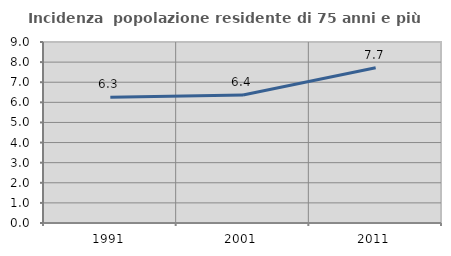
| Category | Incidenza  popolazione residente di 75 anni e più |
|---|---|
| 1991.0 | 6.253 |
| 2001.0 | 6.362 |
| 2011.0 | 7.722 |